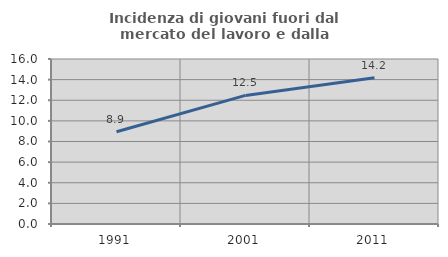
| Category | Incidenza di giovani fuori dal mercato del lavoro e dalla formazione  |
|---|---|
| 1991.0 | 8.946 |
| 2001.0 | 12.47 |
| 2011.0 | 14.184 |